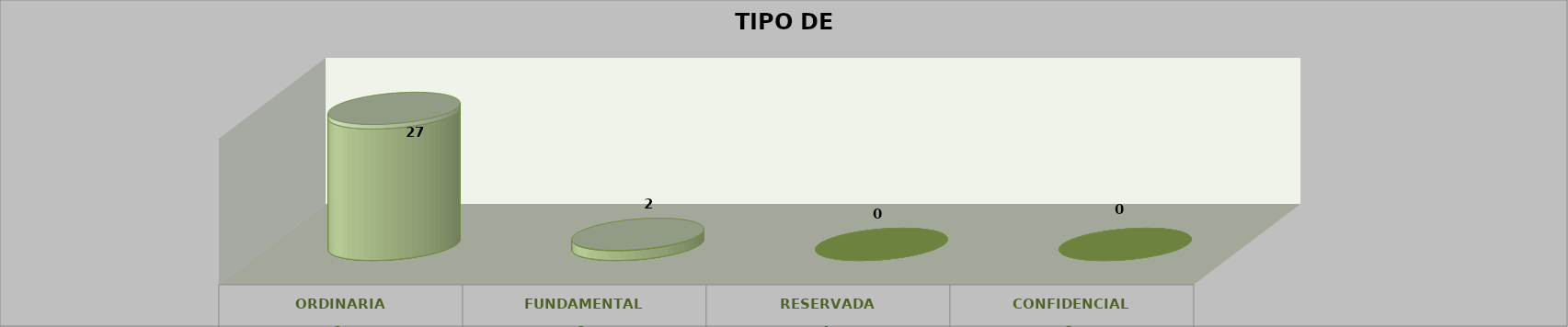
| Category | Series 0 | Series 2 | Series 1 | Series 3 | Series 4 |
|---|---|---|---|---|---|
| 0 |  |  |  | 27 | 0.931 |
| 1 |  |  |  | 2 | 0.069 |
| 2 |  |  |  | 0 | 0 |
| 3 |  |  |  | 0 | 0 |